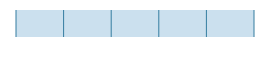
| Category | Onderhandelinspositie van leveranciers |
|---|---|
| 0 | 0 |